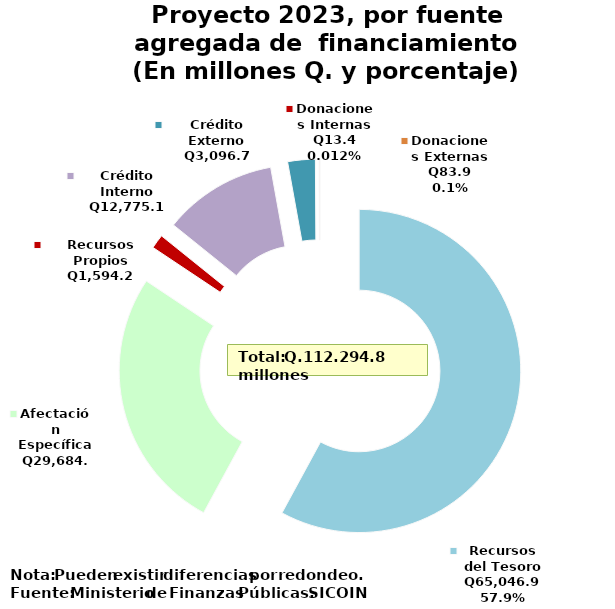
| Category | Recomendado 2018 |
|---|---|
| Recursos del Tesoro | 65046.9 |
| Afectación Específica | 29684.6 |
| Recursos Propios | 1594.2 |
| Crédito Interno | 12775.1 |
| Crédito Externo | 3096.7 |
| Donaciones Externas | 83.9 |
| Donaciones Internas | 13.4 |